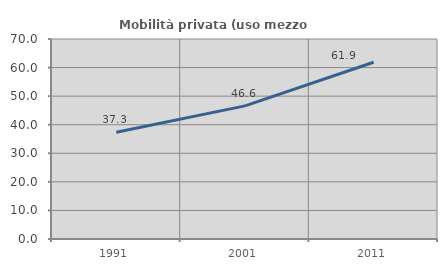
| Category | Mobilità privata (uso mezzo privato) |
|---|---|
| 1991.0 | 37.333 |
| 2001.0 | 46.595 |
| 2011.0 | 61.852 |